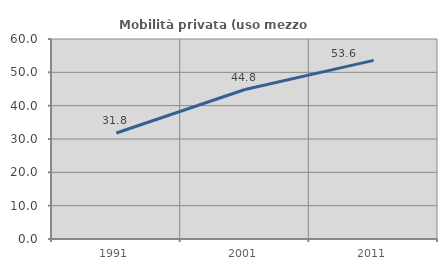
| Category | Mobilità privata (uso mezzo privato) |
|---|---|
| 1991.0 | 31.798 |
| 2001.0 | 44.838 |
| 2011.0 | 53.579 |